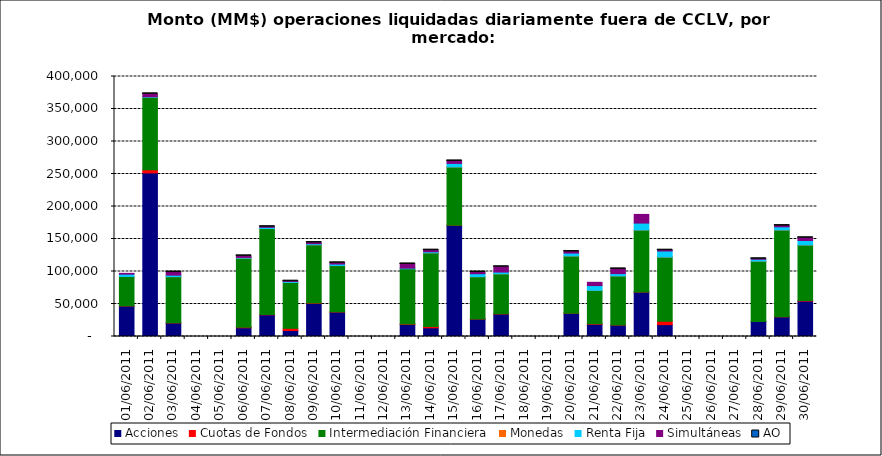
| Category | Acciones | Cuotas de Fondos | Intermediación Financiera | Monedas | Renta Fija | Simultáneas | AO |
|---|---|---|---|---|---|---|---|
| 01/06/2011 | 46898.388 | 183.546 | 45259.077 | 17.418 | 3570.776 | 1224.201 | 0 |
| 02/06/2011 | 251658.9 | 4970.763 | 111408.122 | 5.82 | 865.59 | 4411.649 | 0.05 |
| 03/06/2011 | 20803.96 | 280.098 | 70971.335 | 23.388 | 2299.539 | 4767.406 | 0.041 |
| 06/06/2011 | 13430.364 | 924.433 | 106150.563 | 7.02 | 1133.916 | 2425.894 | 0.241 |
| 07/06/2011 | 33351.114 | 502.168 | 132224.511 | 4.095 | 1911.063 | 912.892 | 0.259 |
| 08/06/2011 | 9247.874 | 3347.692 | 70577.161 | 33.134 | 1515.056 | 380.061 | 0.098 |
| 09/06/2011 | 50999.943 | 610.683 | 89478.128 | 31.514 | 1613.163 | 1770.021 | 0.375 |
| 10/06/2011 | 37625.042 | 326.418 | 71180.977 | 31.694 | 2293.583 | 1861.805 | 0.235 |
| 13/06/2011 | 18503.146 | 862.279 | 84828.268 | 0 | 938.366 | 6480.302 | 0.218 |
| 14/06/2011 | 13353.613 | 2120.246 | 113256.19 | 11.324 | 1624.929 | 2463.74 | 0.105 |
| 15/06/2011 | 170814.916 | 303.706 | 89738.61 | 1.192 | 5458.924 | 3791.876 | 0.036 |
| 16/06/2011 | 26879.62 | 104.843 | 65033.314 | 11.425 | 4570.292 | 2551.91 | 0.202 |
| 17/06/2011 | 34610.678 | 366.307 | 61455.031 | 7.865 | 2716.262 | 8116.018 | 0.036 |
| 20/06/2011 | 35665.086 | 74.664 | 88160.54 | 2.42 | 4427.122 | 2394.847 | 0.016 |
| 21/06/2011 | 18777.523 | 769.934 | 51501.127 | 1.496 | 7289.403 | 5010.56 | 0 |
| 22/06/2011 | 17485.551 | 225.715 | 75490.551 | 2.472 | 3570.404 | 7234.956 | 0.007 |
| 23/06/2011 | 68244.872 | 281.714 | 95323.816 | 13.138 | 10622.38 | 13353.236 | 0 |
| 24/06/2011 | 18247.896 | 5236.652 | 98678.314 | 114.274 | 9299.071 | 1188.916 | 0.042 |
| 28/06/2011 | 23122.325 | 96.527 | 92640.441 | 67.534 | 2951.971 | 675.098 | 0.01 |
| 29/06/2011 | 30186.693 | 142.131 | 133519.533 | 73.3 | 4869.094 | 1826.913 | 0.518 |
| 30/06/2011 | 54525.192 | 735.97 | 85605.072 | 9.1 | 6772.419 | 4241.903 | 0.635 |